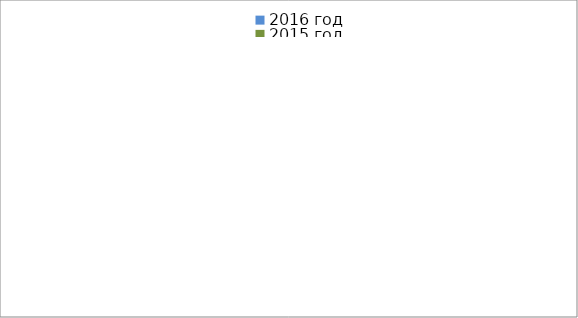
| Category | 2016 год | 2015 год |
|---|---|---|
|  - поджог | 22 | 15 |
|  - неосторожное обращение с огнём | 17 | 36 |
|  - НПТЭ электрооборудования | 6 | 8 |
|  - НПУ и Э печей | 24 | 26 |
|  - НПУ и Э транспортных средств | 15 | 31 |
|   -Шалость с огнем детей | 5 | 3 |
|  -НППБ при эксплуатации эл.приборов | 7 | 10 |
|  - курение | 6 | 15 |
| - прочие | 67 | 60 |
| - не установленные причины | 12 | 7 |